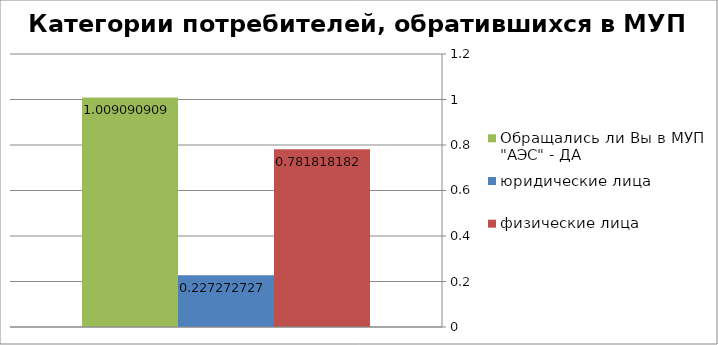
| Category | Обращались ли Вы в МУП "АЭС" - ДА  | юридические лица | физические лица |
|---|---|---|---|
| да | 1.009 | 0.227 | 0.782 |